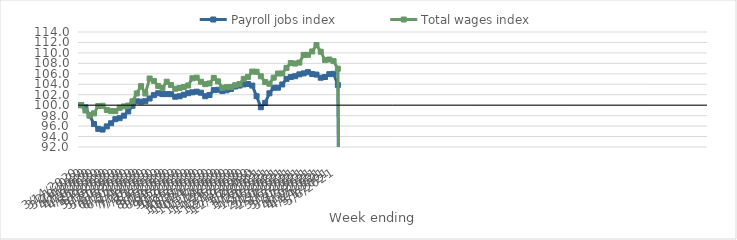
| Category | Payroll jobs index | Total wages index |
|---|---|---|
| 14/03/2020 | 100 | 100 |
| 21/03/2020 | 99.57 | 98.977 |
| 28/03/2020 | 98.032 | 98.036 |
| 04/04/2020 | 96.393 | 98.43 |
| 11/04/2020 | 95.463 | 99.835 |
| 18/04/2020 | 95.334 | 99.886 |
| 25/04/2020 | 95.945 | 99.1 |
| 02/05/2020 | 96.544 | 98.87 |
| 09/05/2020 | 97.323 | 98.859 |
| 16/05/2020 | 97.515 | 99.499 |
| 23/05/2020 | 97.993 | 99.765 |
| 30/05/2020 | 98.812 | 99.922 |
| 06/06/2020 | 99.886 | 100.741 |
| 13/06/2020 | 100.728 | 102.25 |
| 20/06/2020 | 100.676 | 103.638 |
| 27/06/2020 | 100.753 | 102.262 |
| 04/07/2020 | 101.281 | 105.1 |
| 11/07/2020 | 101.923 | 104.647 |
| 18/07/2020 | 102.278 | 103.681 |
| 25/07/2020 | 102.117 | 103.3 |
| 01/08/2020 | 102.121 | 104.49 |
| 08/08/2020 | 102.104 | 103.876 |
| 15/08/2020 | 101.617 | 103.138 |
| 22/08/2020 | 101.704 | 103.276 |
| 29/08/2020 | 101.997 | 103.485 |
| 05/09/2020 | 102.296 | 103.768 |
| 12/09/2020 | 102.463 | 105.15 |
| 19/09/2020 | 102.585 | 105.264 |
| 26/09/2020 | 102.381 | 104.477 |
| 03/10/2020 | 101.716 | 104.021 |
| 10/10/2020 | 101.947 | 104.156 |
| 17/10/2020 | 102.878 | 105.213 |
| 24/10/2020 | 102.945 | 104.558 |
| 31/10/2020 | 102.698 | 103.32 |
| 07/11/2020 | 102.848 | 103.443 |
| 14/11/2020 | 103.092 | 103.49 |
| 21/11/2020 | 103.565 | 103.818 |
| 28/11/2020 | 103.749 | 104.036 |
| 05/12/2020 | 103.971 | 105.039 |
| 12/12/2020 | 104.052 | 105.413 |
| 19/12/2020 | 103.747 | 106.431 |
| 26/12/2020 | 101.716 | 106.394 |
| 02/01/2021 | 99.605 | 105.526 |
| 09/01/2021 | 100.438 | 104.43 |
| 16/01/2021 | 102.275 | 104.101 |
| 23/01/2021 | 103.341 | 105.266 |
| 30/01/2021 | 103.345 | 106.063 |
| 06/02/2021 | 103.961 | 106.067 |
| 13/02/2021 | 105.037 | 107.143 |
| 20/02/2021 | 105.38 | 108.052 |
| 27/02/2021 | 105.544 | 107.967 |
| 06/03/2021 | 105.897 | 108.149 |
| 13/03/2021 | 106.084 | 109.626 |
| 20/03/2021 | 106.317 | 109.628 |
| 27/03/2021 | 105.954 | 110.284 |
| 03/04/2021 | 105.855 | 111.503 |
| 10/04/2021 | 105.248 | 110.23 |
| 17/04/2021 | 105.391 | 108.626 |
| 24/04/2021 | 105.93 | 108.739 |
| 01/05/2021 | 105.997 | 108.422 |
| 08/05/2021 | 103.856 | 106.979 |